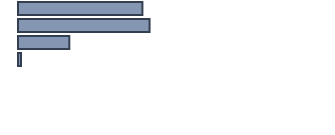
| Category | Series 0 |
|---|---|
| 0 | 40 |
| 1 | 42.3 |
| 2 | 16.5 |
| 3 | 1 |
| 4 | 0 |
| 5 | 0 |
| 6 | 0 |